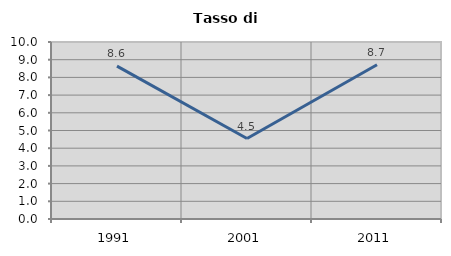
| Category | Tasso di disoccupazione   |
|---|---|
| 1991.0 | 8.634 |
| 2001.0 | 4.544 |
| 2011.0 | 8.715 |